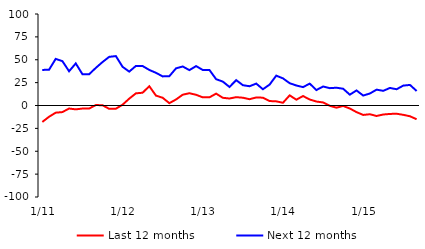
| Category | Last 12 months | Next 12 months |
|---|---|---|
|  1/11 | -17.96 | 38.89 |
|  2/11 | -12.33 | 39.05 |
|  3/11 | -7.84 | 50.96 |
|  4/11 | -7.2 | 48.47 |
|  5/11 | -3.3 | 37.42 |
|  6/11 | -4.21 | 45.99 |
|  7/11 | -3.33 | 34.17 |
|  8/11 | -3.33 | 34.17 |
|  9/11 | 0.51 | 41.09 |
|  10/11 | 0.28 | 47.47 |
|  11/11 | -3.65 | 53.17 |
|  12/11 | -3.52 | 53.99 |
|  1/12 | 0.85 | 42.3 |
|  2/12 | 7.49 | 37.02 |
|  3/12 | 13.29 | 43.26 |
|  4/12 | 13.96 | 43.14 |
|  5/12 | 21.08 | 38.87 |
|  6/12 | 10.81 | 35.74 |
|  7/12 | 8.46 | 31.81 |
|  8/12 | 2.55 | 32.03 |
|  9/12 | 6.58 | 40.6 |
|  10/12 | 11.79 | 42.65 |
|  11/12 | 13.41 | 38.66 |
|  12/12 | 11.71 | 43.07 |
|  1/13 | 8.92 | 38.82 |
|  2/13 | 8.92 | 38.82 |
|  3/13 | 12.98 | 28.75 |
|  4/13 | 8.4 | 26.12 |
|  5/13 | 7.64 | 20.26 |
|  6/13 | 9.1 | 27.71 |
|  7/13 | 8.51 | 22.2 |
|  8/13 | 6.89 | 21.06 |
|  9/13 | 8.81 | 23.95 |
|  10/13 | 8.54 | 17.76 |
|  11/13 | 4.88 | 22.87 |
|  12/13 | 4.53 | 32.62 |
|  1/14 | 2.99 | 29.64 |
|  2/14 | 11.1 | 24.37 |
|  3/14 | 6.35 | 21.86 |
|  4/14 | 10.34 | 20.09 |
|  5/14 | 6.57 | 23.91 |
|  6/14 | 4.33 | 16.91 |
|  7/14 | 3.35 | 20.75 |
|  8/14 | -0.33 | 18.95 |
|  9/14 | -2.37 | 19.44 |
|  10/14 | -0.5 | 18.32 |
|  11/14 | -3.3 | 11.85 |
|  12/14 | -7.21 | 16.46 |
|  1/15 | -10.32 | 10.88 |
|  2/15 | -9.55 | 13.1 |
|  3/15 | -11.45 | 17.32 |
|  4/15 | -9.85 | 16.04 |
|  5/15 | -9.22 | 19.19 |
|  6/15 | -8.99 | 17.77 |
|  7/15 | -10.2 | 21.74 |
|  8/15 | -11.76 | 22.49 |
|  9/15 | -15.03 | 15.86 |